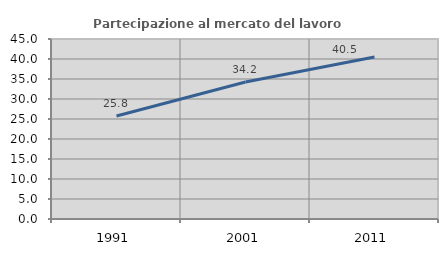
| Category | Partecipazione al mercato del lavoro  femminile |
|---|---|
| 1991.0 | 25.761 |
| 2001.0 | 34.249 |
| 2011.0 | 40.523 |